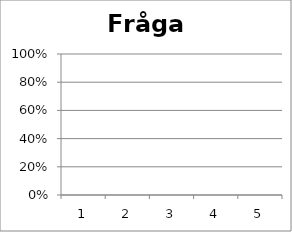
| Category | Fråga 6 |
|---|---|
| 0 | 0 |
| 1 | 0 |
| 2 | 0 |
| 3 | 0 |
| 4 | 0 |